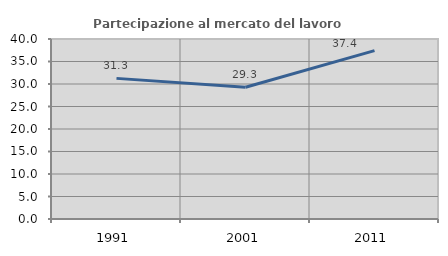
| Category | Partecipazione al mercato del lavoro  femminile |
|---|---|
| 1991.0 | 31.25 |
| 2001.0 | 29.268 |
| 2011.0 | 37.421 |